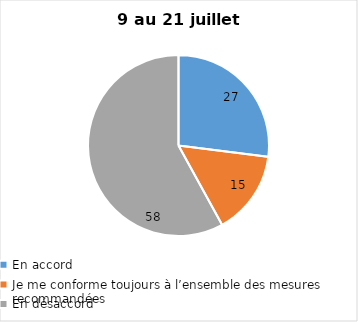
| Category | Series 0 |
|---|---|
| En accord | 27 |
| Je me conforme toujours à l’ensemble des mesures recommandées | 15 |
| En désaccord | 58 |